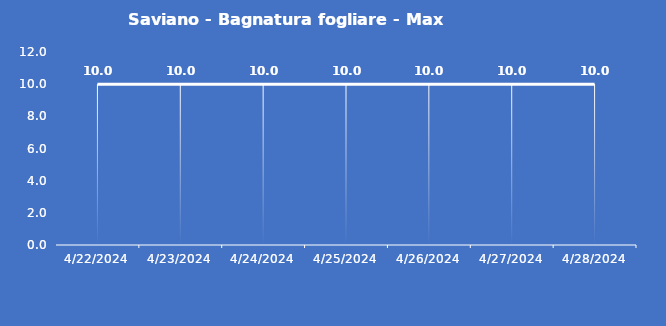
| Category | Saviano - Bagnatura fogliare - Max (min) |
|---|---|
| 4/22/24 | 10 |
| 4/23/24 | 10 |
| 4/24/24 | 10 |
| 4/25/24 | 10 |
| 4/26/24 | 10 |
| 4/27/24 | 10 |
| 4/28/24 | 10 |